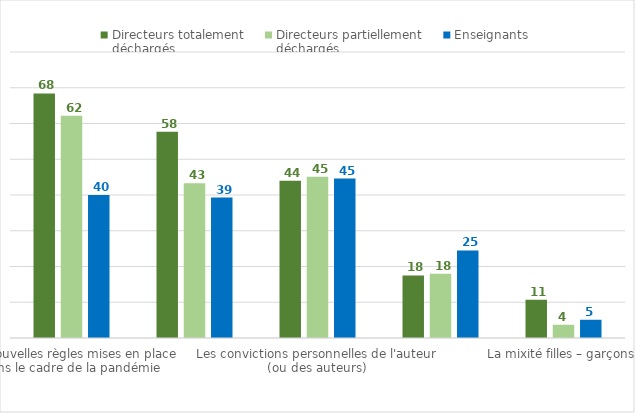
| Category | Directeurs totalement 
déchargés | Directeurs partiellement 
déchargés | Enseignants |
|---|---|---|---|
| Les nouvelles règles mises en place dans le cadre de la pandémie | 68.4 | 62.2 | 40 |
| Les règles de l'école ou le contenu pédagogique sont contestées au nom de convictions religieuses, philosophiques ou politiques | 57.7 | 43.3 | 39.3 |
| Les convictions personnelles de l'auteur (ou des auteurs) | 44 | 45.1 | 44.6 |
| La légitimité à enseigner certains sujets, disciplines, etc. | 17.5 | 18 | 24.5 |
| La mixité filles – garçons | 10.7 | 3.7 | 5.1 |